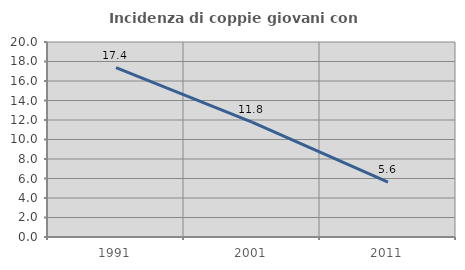
| Category | Incidenza di coppie giovani con figli |
|---|---|
| 1991.0 | 17.363 |
| 2001.0 | 11.785 |
| 2011.0 | 5.63 |